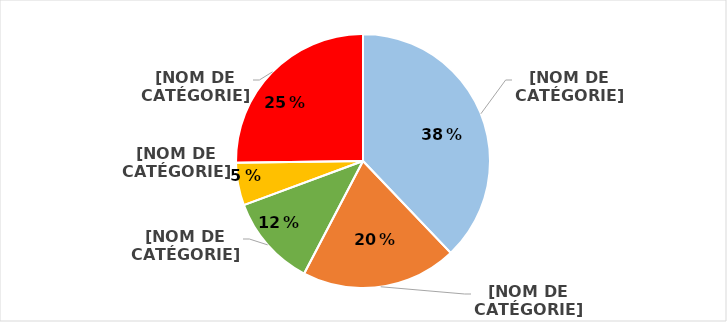
| Category | Series 0 |
|---|---|
| N'a pas tenté de contacter l'auteur | 0.379 |
| A essayé en vain de contacter l'auteur  | 0.198 |
| A obtenu un remboursement total ou partiel par l'auteur | 0.117 |
| Est en attente du traitement de son dossier par l'auteur | 0.054 |
| N'a obtenu aucun remboursement par l'auteur | 0.252 |